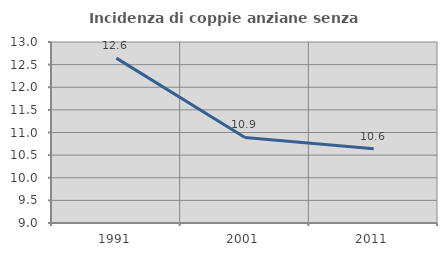
| Category | Incidenza di coppie anziane senza figli  |
|---|---|
| 1991.0 | 12.644 |
| 2001.0 | 10.891 |
| 2011.0 | 10.638 |